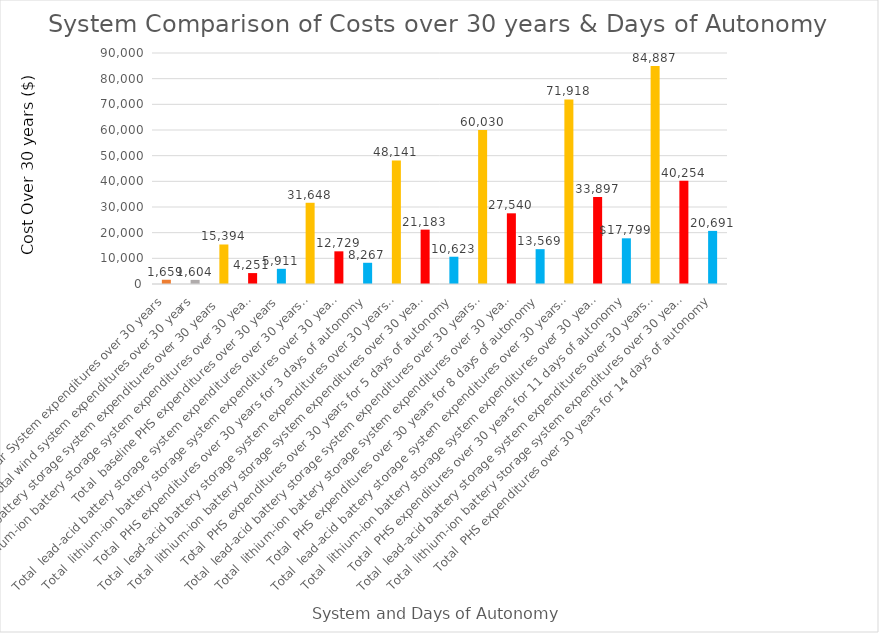
| Category | Series 0 |
|---|---|
| Total Solar System expenditures over 30 years | 1659.2 |
| Total wind system expenditures over 30 years | 1604.2 |
| Total  lead-acid battery storage system expenditures over 30 years  | 15394 |
| Total  lithium-ion battery storage system expenditures over 30 years | 4251 |
| Total  baseline PHS expenditures over 30 years | 5911.467 |
| Total  lead-acid battery storage system expenditures over 30 years 3 Days of Autonomy | 31648 |
| Total  lithium-ion battery storage system expenditures over 30 years  3 Days of Autonomy | 12729 |
| Total  PHS expenditures over 30 years for 3 days of autonomy | 8267.46 |
| Total  lead-acid battery storage system expenditures over 30 years 5  Days of Autonomy | 48141.25 |
| Total  lithium-ion battery storage system expenditures over 30 years  | 21183 |
| Total  PHS expenditures over 30 years for 5 days of autonomy | 10623.453 |
| Total  lead-acid battery storage system expenditures over 30 years  8 Days of Autonomy | 60029.5 |
| Total  lithium-ion battery storage system expenditures over 30 years  8 Days of Autonomy | 27540 |
| Total  PHS expenditures over 30 years for 8 days of autonomy | 13569.274 |
| Total  lead-acid battery storage system expenditures over 30 years  11 Days of Autonomy | 71917.75 |
| Total  lithium-ion battery storage system expenditures over 30 years 11 Days of Autonomy | 33897 |
| Total  PHS expenditures over 30 years for 11 days of autonomy | 17798.674 |
| Total  lead-acid battery storage system expenditures over 30 years  14 Days of Autonomy | 84886.75 |
| Total  lithium-ion battery storage system expenditures over 30 years  14 Days of Autonomy | 40254 |
| Total  PHS expenditures over 30 years for 14 days of autonomy | 20690.874 |